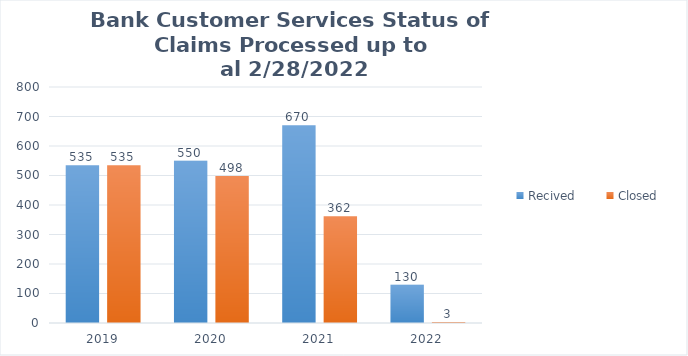
| Category | Recived | Closed |
|---|---|---|
| 2019.0 | 535 | 535 |
| 2020.0 | 550 | 498 |
| 2021.0 | 670 | 362 |
| 2022.0 | 130 | 3 |